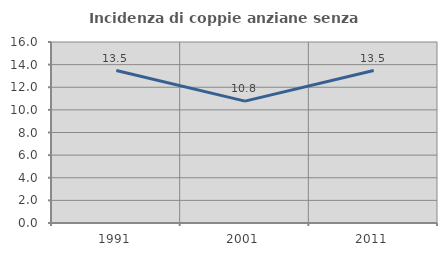
| Category | Incidenza di coppie anziane senza figli  |
|---|---|
| 1991.0 | 13.478 |
| 2001.0 | 10.772 |
| 2011.0 | 13.476 |